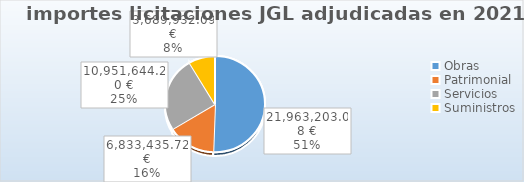
| Category | Series 0 |
|---|---|
| Obras | 21963203.08 |
| Patrimonial | 6833435.72 |
| Servicios | 10951644.2 |
| Suministros | 3689932.09 |